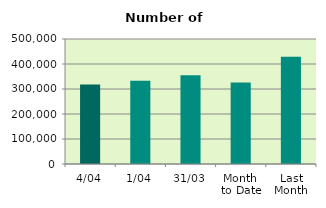
| Category | Series 0 |
|---|---|
| 4/04 | 318158 |
| 1/04 | 333488 |
| 31/03 | 355356 |
| Month 
to Date | 325823 |
| Last
Month | 428970.609 |